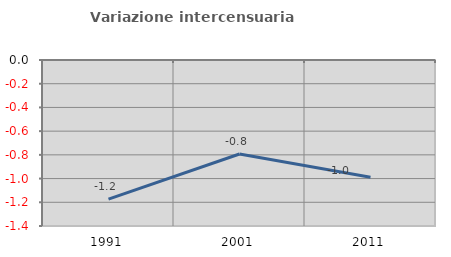
| Category | Variazione intercensuaria annua |
|---|---|
| 1991.0 | -1.173 |
| 2001.0 | -0.793 |
| 2011.0 | -0.989 |